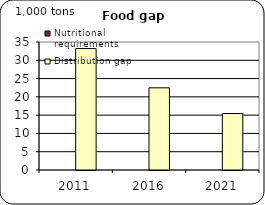
| Category | Nutritional requirements | Distribution gap |
|---|---|---|
| 2011.0 | 0 | 33.208 |
| 2016.0 | 0 | 22.47 |
| 2021.0 | 0 | 15.439 |